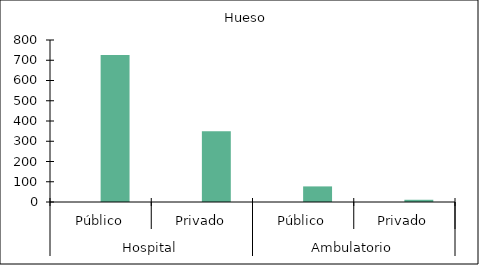
| Category |   |    Hueso |
|---|---|---|
| 0 | 0 | 726 |
| 1 | 0 | 349 |
| 2 | 0 | 77 |
| 3 | 0 | 11 |